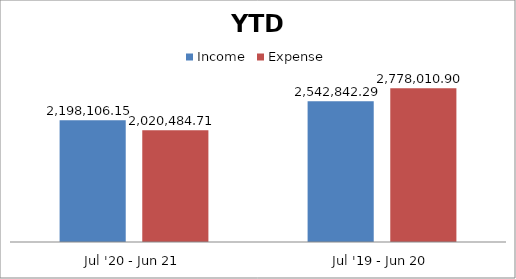
| Category | Income | Expense |
|---|---|---|
| Jul '20 - Jun 21 | 2198106.15 | 2020484.71 |
| Jul '19 - Jun 20 | 2542842.29 | 2778010.9 |